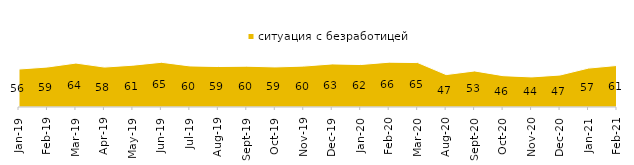
| Category | ситуация с безработицей |
|---|---|
| 2019-01-01 | 55.55 |
| 2019-02-01 | 58.5 |
| 2019-03-01 | 64.296 |
| 2019-04-01 | 58.416 |
| 2019-05-01 | 61.169 |
| 2019-06-01 | 65.436 |
| 2019-07-01 | 60.099 |
| 2019-08-01 | 59.241 |
| 2019-09-01 | 59.703 |
| 2019-10-01 | 58.614 |
| 2019-11-01 | 59.851 |
| 2019-12-01 | 63.02 |
| 2020-01-01 | 62.129 |
| 2020-02-01 | 65.594 |
| 2020-03-01 | 64.998 |
| 2020-08-01 | 47.418 |
| 2020-09-01 | 52.763 |
| 2020-10-01 | 45.84 |
| 2020-11-01 | 44 |
| 2020-12-01 | 46.802 |
| 2021-01-01 | 56.93 |
| 2021-02-01 | 60.794 |